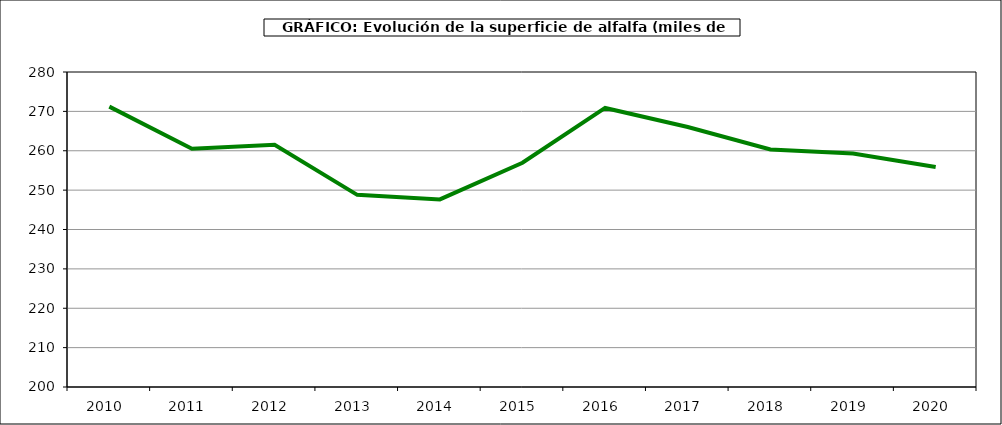
| Category | Superficie |
|---|---|
| 2010.0 | 271.204 |
| 2011.0 | 260.531 |
| 2012.0 | 261.526 |
| 2013.0 | 248.801 |
| 2014.0 | 247.639 |
| 2015.0 | 256.952 |
| 2016.0 | 270.874 |
| 2017.0 | 266.025 |
| 2018.0 | 260.337 |
| 2019.0 | 259.287 |
| 2020.0 | 255.89 |